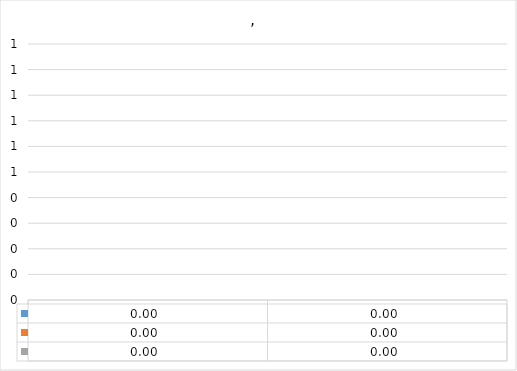
| Category | Series 0 | Series 1 | Series 2 |
|---|---|---|---|
| 0 | 0 | 0 | 0 |
| 1 | 0 | 0 | 0 |